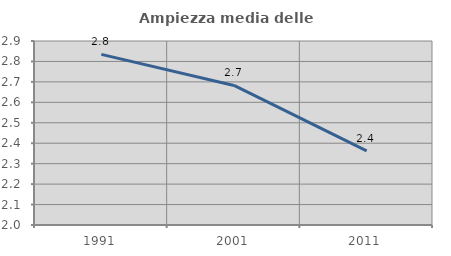
| Category | Ampiezza media delle famiglie |
|---|---|
| 1991.0 | 2.834 |
| 2001.0 | 2.683 |
| 2011.0 | 2.362 |